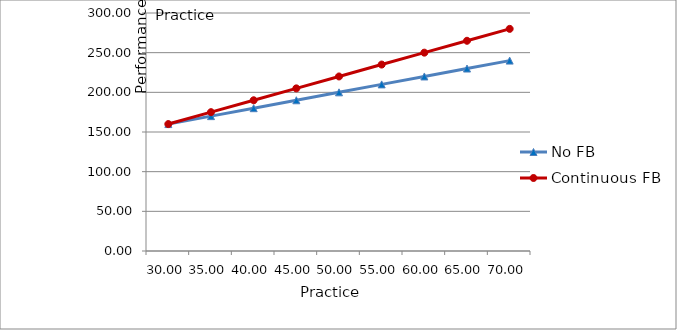
| Category | No FB | Continuous FB |
|---|---|---|
| 30.0 | 160 | 160 |
| 35.0 | 170 | 175 |
| 40.0 | 180 | 190 |
| 45.0 | 190 | 205 |
| 50.0 | 200 | 220 |
| 55.0 | 210 | 235 |
| 60.0 | 220 | 250 |
| 65.0 | 230 | 265 |
| 70.0 | 240 | 280 |